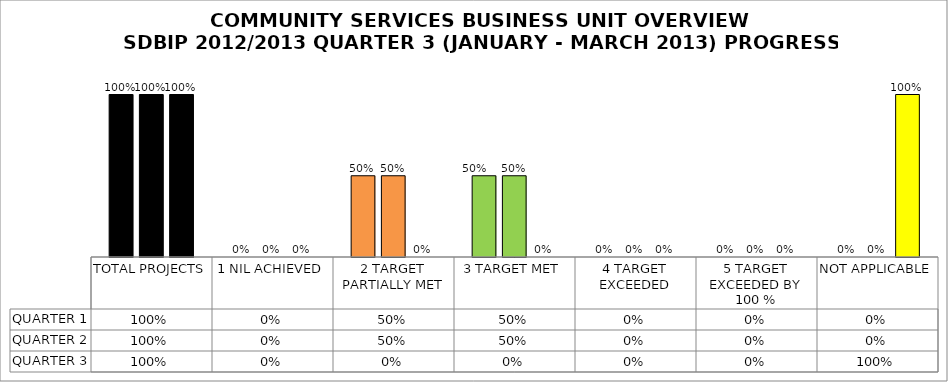
| Category | QUARTER 1 | QUARTER 2 | QUARTER 3 |
|---|---|---|---|
| TOTAL PROJECTS | 1 | 1 | 1 |
| 1 NIL ACHIEVED | 0 | 0 | 0 |
| 2 TARGET PARTIALLY MET | 0.5 | 0.5 | 0 |
| 3 TARGET MET | 0.5 | 0.5 | 0 |
| 4 TARGET EXCEEDED | 0 | 0 | 0 |
| 5 TARGET EXCEEDED BY 100 % | 0 | 0 | 0 |
| NOT APPLICABLE | 0 | 0 | 1 |